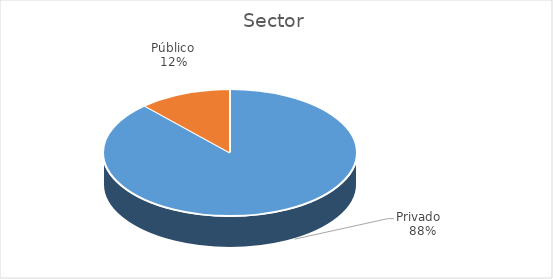
| Category | Total |
|---|---|
| Privado   | 30 |
| Público | 4 |